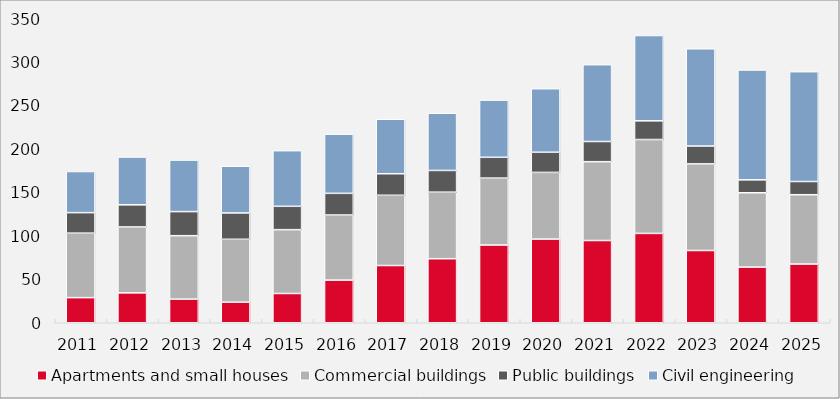
| Category | Apartments and small houses | Commercial buildings | Public buildings | Civil engineering |
|---|---|---|---|---|
| 2011.0 | 28.928 | 74.239 | 23.613 | 47.336 |
| 2012.0 | 34.438 | 75.86 | 25.502 | 55.006 |
| 2013.0 | 27.195 | 73.048 | 27.736 | 59.327 |
| 2014.0 | 23.669 | 72.424 | 30.324 | 53.815 |
| 2015.0 | 33.686 | 73.5 | 26.898 | 64.04 |
| 2016.0 | 49.11 | 74.934 | 24.944 | 68.169 |
| 2017.0 | 65.905 | 80.869 | 24.8 | 62.715 |
| 2018.0 | 73.73 | 76.618 | 24.994 | 65.851 |
| 2019.0 | 89.529 | 77.016 | 23.947 | 65.851 |
| 2020.0 | 96.336 | 76.765 | 23.233 | 73.095 |
| 2021.0 | 94.696 | 90.733 | 23.242 | 88.445 |
| 2022.0 | 102.864 | 108.084 | 21.56 | 98.174 |
| 2023.0 | 83.188 | 99.742 | 20.561 | 111.918 |
| 2024.0 | 64.088 | 85.579 | 14.882 | 126.467 |
| 2025.0 | 67.603 | 79.803 | 15.203 | 126.467 |